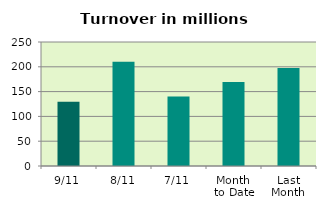
| Category | Series 0 |
|---|---|
| 9/11 | 129.366 |
| 8/11 | 210.215 |
| 7/11 | 140.018 |
| Month 
to Date | 169.311 |
| Last
Month | 197.652 |